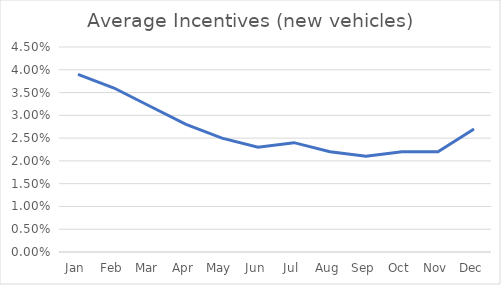
| Category | Series 0 |
|---|---|
| Jan | 0.039 |
| Feb | 0.036 |
| Mar | 0.032 |
| Apr | 0.028 |
| May | 0.025 |
| Jun | 0.023 |
| Jul | 0.024 |
| Aug | 0.022 |
| Sep | 0.021 |
| Oct | 0.022 |
| Nov | 0.022 |
| Dec | 0.027 |